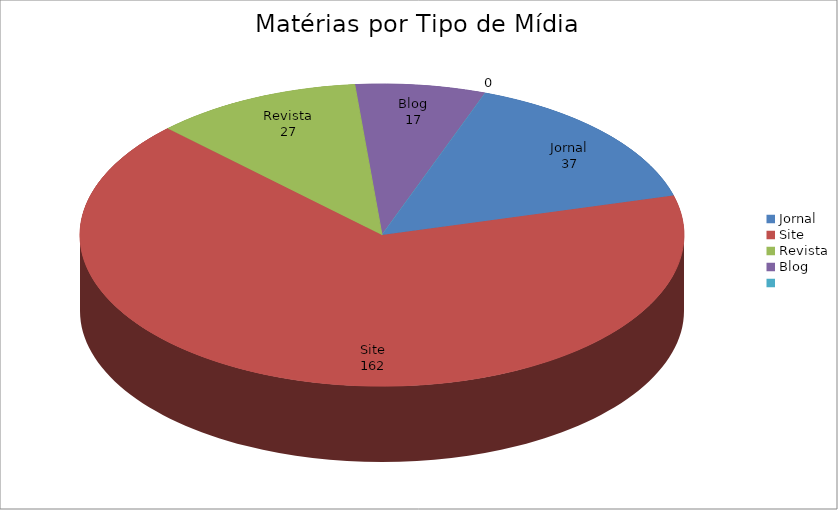
| Category | Series 0 |
|---|---|
| Jornal | 37 |
| Site | 162 |
| Revista | 27 |
| Blog | 17 |